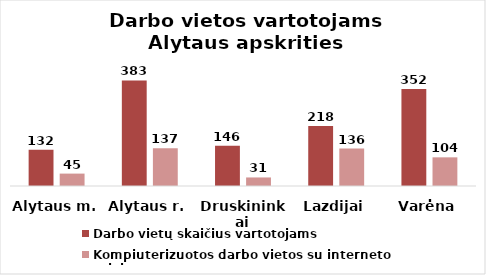
| Category | Darbo vietų skaičius vartotojams | Kompiuterizuotos darbo vietos su interneto prieiga |
|---|---|---|
| Alytaus m. | 132 | 45 |
| Alytaus r. | 383 | 137 |
| Druskininkai | 146 | 31 |
| Lazdijai | 218 | 136 |
| Varėna | 352 | 104 |